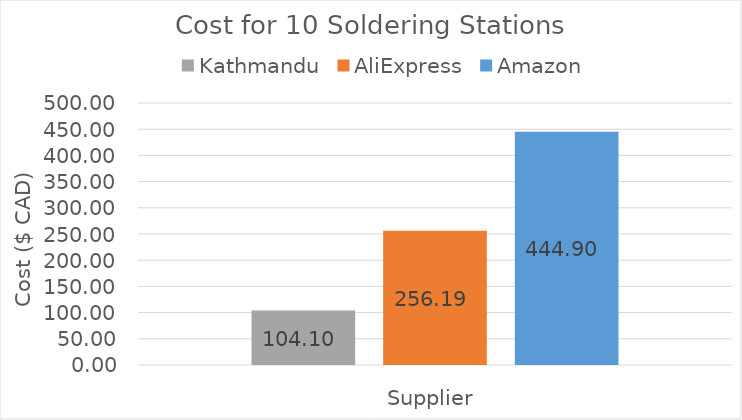
| Category | Kathmandu | AliExpress | Amazon |
|---|---|---|---|
| 0 | 104.1 | 256.192 | 444.9 |